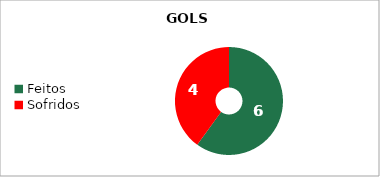
| Category | Series 1 |
|---|---|
| Feitos | 6 |
| Sofridos | 4 |